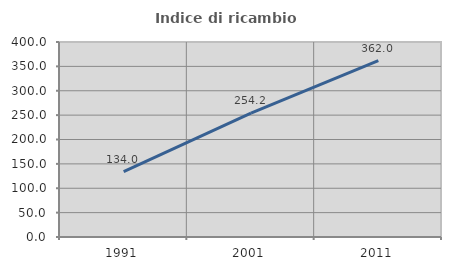
| Category | Indice di ricambio occupazionale  |
|---|---|
| 1991.0 | 134.021 |
| 2001.0 | 254.237 |
| 2011.0 | 362 |